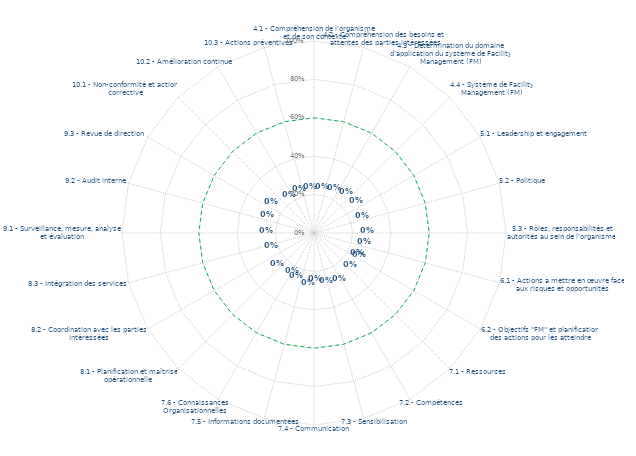
| Category | 60% | Résultats |
|---|---|---|
| 4.1 - Compréhension de l'organisme et de son contexte | 0.6 | 0 |
| 4.2 - Compréhension des besoins et attentes des parties intéressées | 0.6 | 0 |
| 4.3 - Détermination du domaine d’application du système de Facility Management (FM) | 0.6 | 0 |
| 4.4 - Système de Facility Management (FM) | 0.6 | 0 |
| 5.1 - Leadership et engagement | 0.6 | 0 |
| 5.2 - Politique | 0.6 | 0 |
| 5.3 - Rôles, responsabilités et autorités au sein de l'organisme | 0.6 | 0 |
| 6.1 - Actions à mettre en œuvre face aux risques et opportunités | 0.6 | 0 |
| 6.2 - Objectifs "FM" et planification des actions pour les atteindre | 0.6 | 0 |
| 7.1 - Ressources | 0.6 | 0 |
| 7.2 - Compétences | 0.6 | 0 |
| 7.3 - Sensibilisation | 0.6 | 0 |
| 7.4 - Communication | 0.6 | 0 |
| 7.5 - Informations documentées | 0.6 | 0 |
| 7.6 - Connaissances Organisationnelles | 0.6 | 0 |
| 8.1 - Planification et maîtrise opérationnelle | 0.6 | 0 |
| 8.2 - Coordination avec les parties intéressées | 0.6 | 0 |
| 8.3 - Intégration des services | 0.6 | 0 |
| 9.1 - Surveillance, mesure, analyse et évaluation | 0.6 | 0 |
| 9.2 - Audit interne | 0.6 | 0 |
| 9.3 - Revue de direction | 0.6 | 0 |
| 10.1 - Non-conformité et action corrective | 0.6 | 0 |
| 10.2 - Amélioration continue | 0.6 | 0 |
| 10.3 - Actions préventives | 0.6 | 0 |